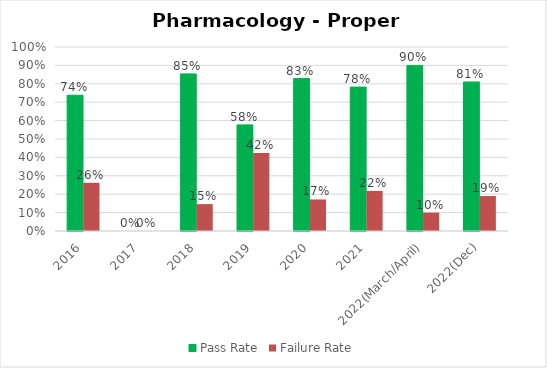
| Category | Pass Rate | Failure Rate |
|---|---|---|
| 2016 | 0.738 | 0.262 |
| 2017 | 0 | 0 |
| 2018 | 0.854 | 0.146 |
| 2019 | 0.577 | 0.423 |
| 2020 | 0.829 | 0.171 |
| 2021 | 0.782 | 0.218 |
| 2022(March/April) | 0.9 | 0.1 |
| 2022(Dec) | 0.81 | 0.19 |